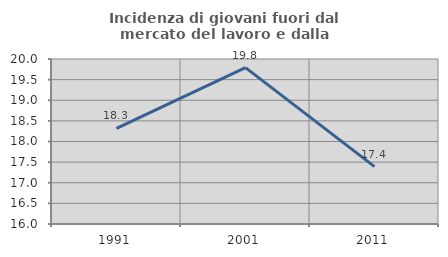
| Category | Incidenza di giovani fuori dal mercato del lavoro e dalla formazione  |
|---|---|
| 1991.0 | 18.321 |
| 2001.0 | 19.792 |
| 2011.0 | 17.391 |